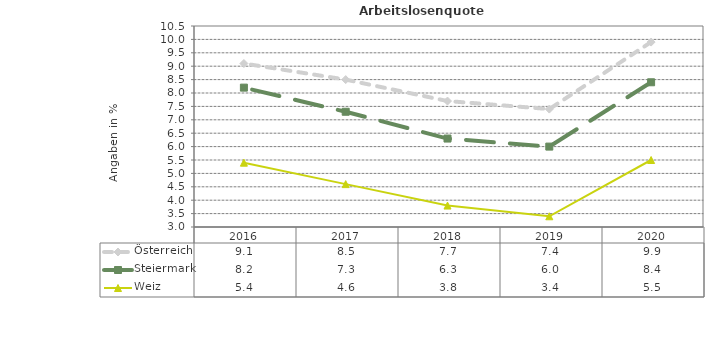
| Category | Österreich | Steiermark | Weiz |
|---|---|---|---|
| 2020.0 | 9.9 | 8.4 | 5.5 |
| 2019.0 | 7.4 | 6 | 3.4 |
| 2018.0 | 7.7 | 6.3 | 3.8 |
| 2017.0 | 8.5 | 7.3 | 4.6 |
| 2016.0 | 9.1 | 8.2 | 5.4 |